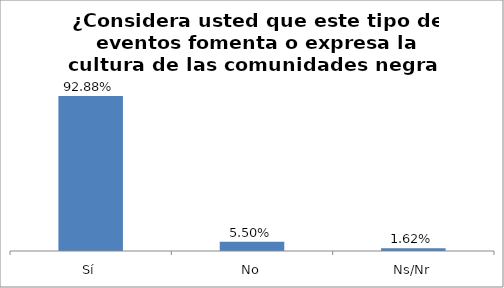
| Category | Total |
|---|---|
| Sí | 0.929 |
| No | 0.055 |
| Ns/Nr | 0.016 |